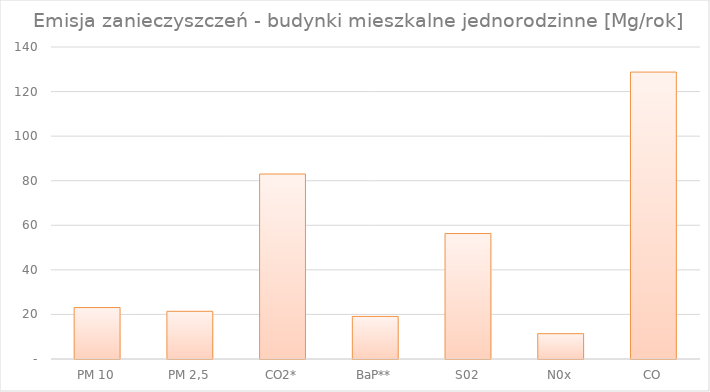
| Category | Series 0 |
|---|---|
| PM 10 | 23.084 |
| PM 2,5 | 21.4 |
| CO2* | 83.002 |
| BaP** | 19.11 |
| S02 | 56.29 |
| N0x | 11.356 |
| CO | 128.74 |